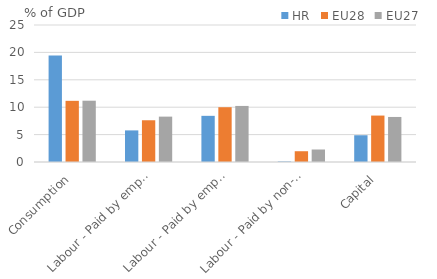
| Category | HR | EU28 | EU27 |
|---|---|---|---|
| Consumption | 19.438 | 11.162 | 11.186 |
| Labour - Paid by employers | 5.767 | 7.618 | 8.281 |
| Labour - Paid by employees | 8.425 | 9.997 | 10.231 |
| Labour - Paid by non-employed | 0.09 | 1.966 | 2.281 |
| Capital | 4.882 | 8.473 | 8.218 |